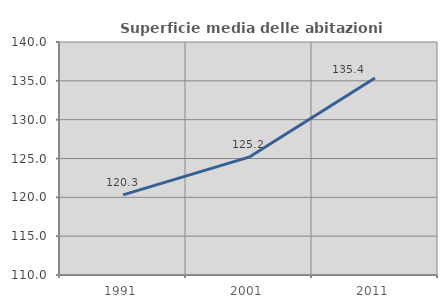
| Category | Superficie media delle abitazioni occupate |
|---|---|
| 1991.0 | 120.314 |
| 2001.0 | 125.171 |
| 2011.0 | 135.372 |